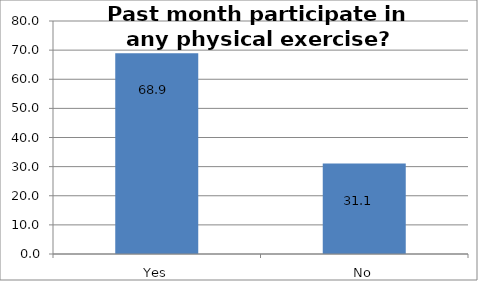
| Category | Series 0 |
|---|---|
| Yes | 68.901 |
| No | 31.099 |